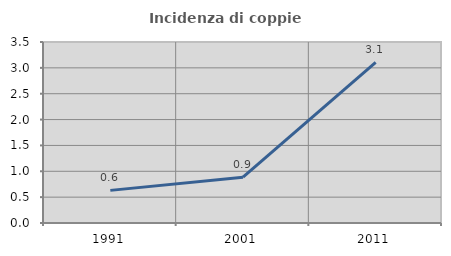
| Category | Incidenza di coppie miste |
|---|---|
| 1991.0 | 0.631 |
| 2001.0 | 0.885 |
| 2011.0 | 3.106 |